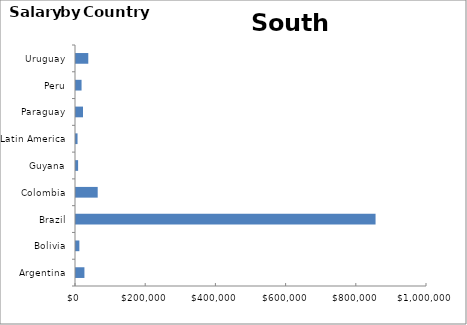
| Category | South America |
|---|---|
| Argentina | 24000 |
| Bolivia | 9600 |
| Brazil | 853440.731 |
| Colombia | 61810 |
| Guyana | 6000 |
| Latin America | 4400 |
| Paraguay | 20000 |
| Peru | 15840 |
| Uruguay | 35000 |